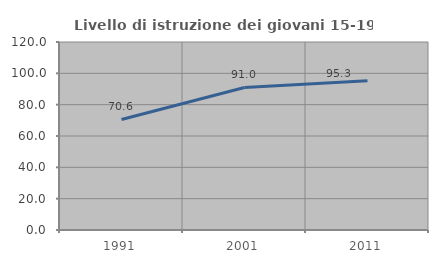
| Category | Livello di istruzione dei giovani 15-19 anni |
|---|---|
| 1991.0 | 70.564 |
| 2001.0 | 90.998 |
| 2011.0 | 95.26 |